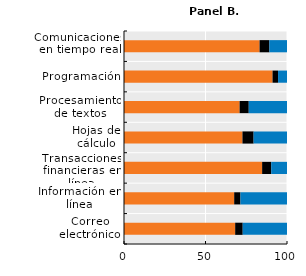
| Category | Nunca  | Menos de una vez por semana | Al menos una vez por semana |
|---|---|---|---|
| Correo electrónico | 68.205 | 4.627 | 27.168 |
| Información en línea | 67.602 | 3.843 | 28.555 |
| Transacciones financieras en línea | 84.744 | 5.576 | 9.679 |
| Hojas de cálculo | 72.675 | 6.841 | 20.484 |
| Procesamiento de textos | 70.929 | 5.609 | 23.462 |
| Programación | 91.125 | 3.389 | 5.486 |
| Comunicaciones en tiempo real | 83.179 | 6.023 | 10.798 |